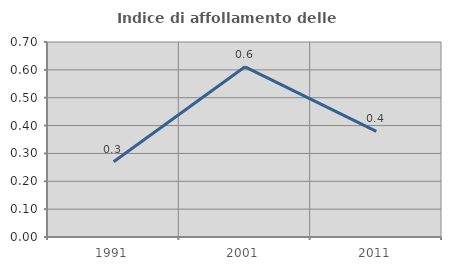
| Category | Indice di affollamento delle abitazioni  |
|---|---|
| 1991.0 | 0.27 |
| 2001.0 | 0.611 |
| 2011.0 | 0.379 |